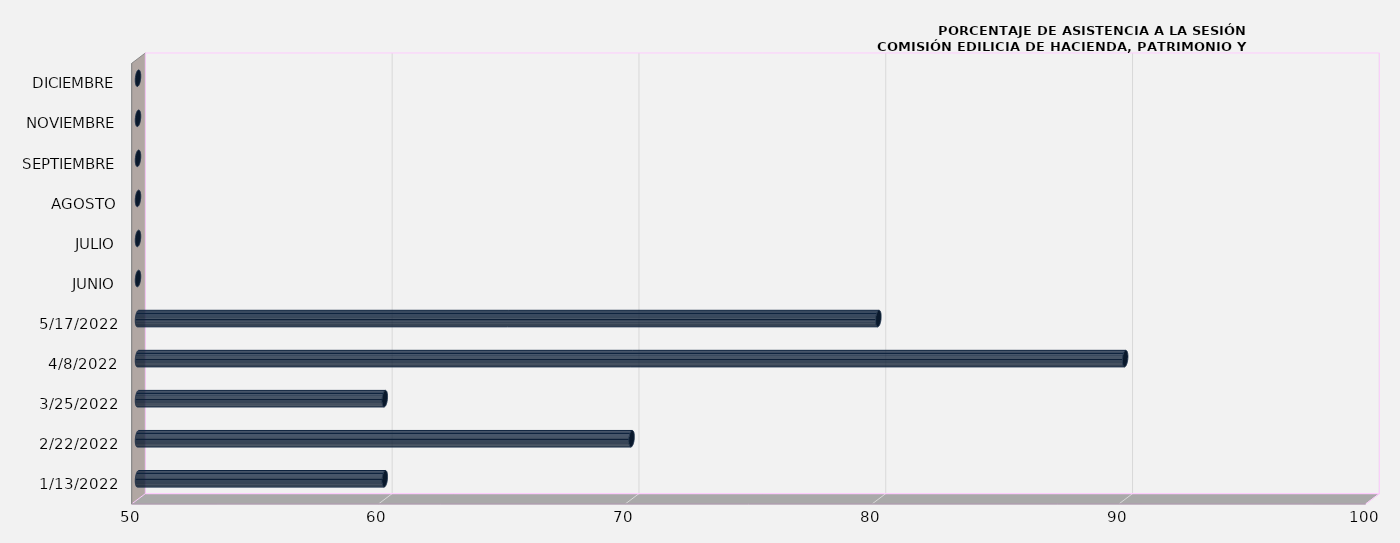
| Category | Series 0 |
|---|---|
| 13/01/2022 | 60 |
| 22/02/2022 | 70 |
| 25/03/2022 | 60 |
| 08/04/2022 | 90 |
| 17/05/2022 | 80 |
| JUNIO | 0 |
| JULIO | 0 |
| AGOSTO | 0 |
| SEPTIEMBRE | 0 |
| NOVIEMBRE | 0 |
| DICIEMBRE | 0 |